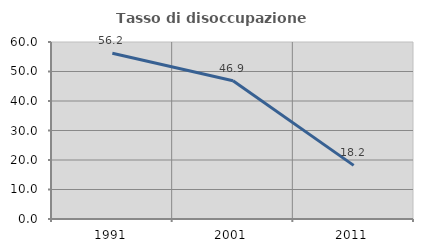
| Category | Tasso di disoccupazione giovanile  |
|---|---|
| 1991.0 | 56.18 |
| 2001.0 | 46.875 |
| 2011.0 | 18.182 |